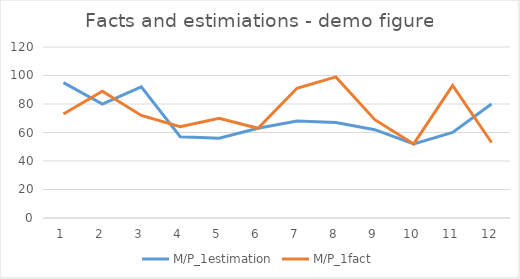
| Category | M/P_1estimation | M/P_1fact |
|---|---|---|
| 1.0 | 95 | 73 |
| 2.0 | 80 | 89 |
| 3.0 | 92 | 72 |
| 4.0 | 57 | 64 |
| 5.0 | 56 | 70 |
| 6.0 | 63 | 63 |
| 7.0 | 68 | 91 |
| 8.0 | 67 | 99 |
| 9.0 | 62 | 69 |
| 10.0 | 52 | 52 |
| 11.0 | 60 | 93 |
| 12.0 | 80 | 53 |